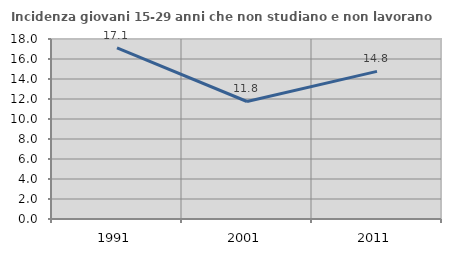
| Category | Incidenza giovani 15-29 anni che non studiano e non lavorano  |
|---|---|
| 1991.0 | 17.123 |
| 2001.0 | 11.751 |
| 2011.0 | 14.759 |